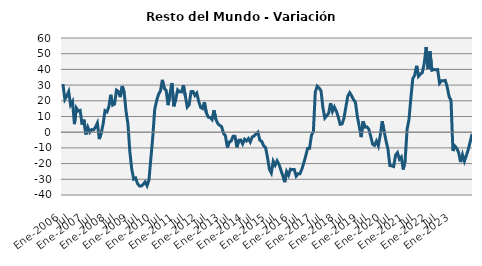
| Category | Series 0 |
|---|---|
| Ene-2006 | 30.612 |
|  | 20.891 |
|  | 23.074 |
|  | 25.884 |
|  | 17.429 |
|  | 19.565 |
| Jul | 5.138 |
|  | 15.412 |
|  | 13.508 |
|  | 13.871 |
|  | 4.804 |
|  | 7.968 |
| Ene-2007 | -1.408 |
|  | 3.116 |
|  | -0.049 |
|  | 1.673 |
|  | 1.454 |
|  | 3.23 |
| Jul | 5.869 |
|  | -4.39 |
|  | -0.552 |
|  | 5.201 |
|  | 13.684 |
|  | 12.917 |
| Ene-2008 | 16.194 |
|  | 23.837 |
|  | 17.24 |
|  | 17.92 |
|  | 26.787 |
|  | 25.949 |
| Jul | 22.334 |
|  | 29.383 |
|  | 25.63 |
|  | 13.246 |
|  | 5.199 |
|  | -12.582 |
| Ene-2009 | -23.653 |
|  | -29.847 |
|  | -29.149 |
|  | -32.696 |
|  | -34.245 |
|  | -34.299 |
| Jul | -33.141 |
|  | -31.652 |
|  | -34.095 |
|  | -30.336 |
|  | -16.443 |
|  | -2.825 |
| Ene-2010 | 14.548 |
|  | 20.12 |
|  | 24.147 |
|  | 26.233 |
|  | 33.339 |
|  | 27.849 |
| Jul | 26.567 |
|  | 17.204 |
|  | 24.529 |
|  | 31.298 |
|  | 16.499 |
|  | 21.061 |
| Ene-2011 | 26.916 |
|  | 25.756 |
|  | 25.618 |
|  | 29.953 |
|  | 23.202 |
|  | 15.999 |
| Jul | 17.441 |
|  | 25.854 |
|  | 25.956 |
|  | 23.415 |
|  | 24.903 |
|  | 19.701 |
| Ene-2012 | 15.843 |
|  | 15.067 |
|  | 19.072 |
|  | 12.369 |
|  | 9.602 |
|  | 9.387 |
| Jul | 8.041 |
|  | 13.972 |
|  | 8.221 |
|  | 5.49 |
|  | 4.358 |
|  | 3.527 |
| Ene-2013 | -0.73 |
|  | -2.334 |
|  | -9.765 |
|  | -6.165 |
|  | -5.574 |
|  | -2.564 |
| Jul | -2.641 |
|  | -9.61 |
|  | -5.14 |
|  | -4.943 |
|  | -7.47 |
|  | -4.453 |
| Ene-2014 | -5.566 |
|  | -4.087 |
|  | -6.276 |
|  | -3.003 |
|  | -2.438 |
|  | -1.129 |
| Jul | -0.031 |
|  | -5.09 |
|  | -5.866 |
|  | -8.686 |
|  | -9.789 |
|  | -16.073 |
| Ene-2015 | -23.588 |
|  | -25.97 |
|  | -18.508 |
|  | -21.026 |
|  | -18.214 |
|  | -20.397 |
| Jul | -24.11 |
|  | -27.678 |
|  | -31.824 |
|  | -25.113 |
|  | -27.446 |
|  | -23.527 |
| Ene-2016 | -23.839 |
|  | -23.838 |
|  | -27.985 |
|  | -26.442 |
|  | -26.485 |
|  | -23.428 |
| Jul | -19.507 |
|  | -15.035 |
|  | -10.296 |
|  | -10.213 |
|  | -1.963 |
|  | 0.419 |
| Ene-2017 | 25.575 |
|  | 29.328 |
|  | 28.17 |
|  | 26.331 |
|  | 15.5 |
|  | 8.996 |
| Jul | 10.459 |
|  | 12.172 |
|  | 18.497 |
|  | 13.2 |
|  | 16.006 |
|  | 13.511 |
| Ene-2018 | 9.704 |
|  | 5.021 |
|  | 5.277 |
|  | 8.966 |
|  | 15.998 |
|  | 22.973 |
| Jul | 25.154 |
|  | 23.207 |
|  | 20.776 |
|  | 19.021 |
|  | 9.893 |
|  | 3.647 |
| Ene-2019 | -3.136 |
|  | 6.928 |
|  | 3.182 |
|  | 3.419 |
|  | 1.936 |
|  | -2.7 |
| Jul | -7.678 |
|  | -8.367 |
|  | -5.662 |
|  | -8.672 |
|  | -1.791 |
|  | 6.918 |
| Ene-2020 | 0.559 |
|  | -5.578 |
|  | -10.625 |
|  | -21.25 |
|  | -21.41 |
|  | -21.848 |
| Jul | -14.557 |
|  | -13.016 |
|  | -17.203 |
|  | -15.804 |
|  | -23.751 |
|  | -18.185 |
| Ene-2021 | 1.627 |
|  | 8.028 |
|  | 21.657 |
|  | 34.116 |
|  | 36.334 |
|  | 42.276 |
| Jul | 35.582 |
|  | 37.015 |
|  | 38.013 |
|  | 43.906 |
|  | 54.275 |
|  | 40.215 |
| Ene-2022 | 51.481 |
|  | 39.457 |
|  | 39.88 |
|  | 39.832 |
|  | 39.876 |
|  | 31.198 |
| Jul | 32.746 |
|  | 32.705 |
|  | 32.973 |
|  | 28.839 |
|  | 22.699 |
|  | 20.314 |
| Ene-2023 | -11.96 |